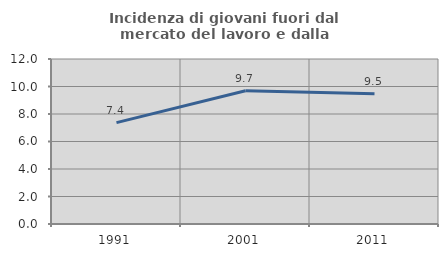
| Category | Incidenza di giovani fuori dal mercato del lavoro e dalla formazione  |
|---|---|
| 1991.0 | 7.376 |
| 2001.0 | 9.686 |
| 2011.0 | 9.47 |